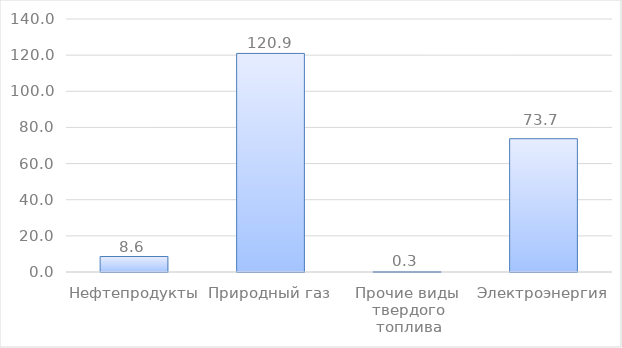
| Category | Series 0 |
|---|---|
| Нефтепродукты | 8.563 |
| Природный газ | 120.95 |
| Прочие виды 
твердого топлива | 0.284 |
| Электроэнергия | 73.744 |